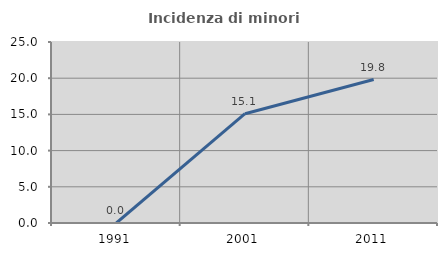
| Category | Incidenza di minori stranieri |
|---|---|
| 1991.0 | 0 |
| 2001.0 | 15.094 |
| 2011.0 | 19.82 |